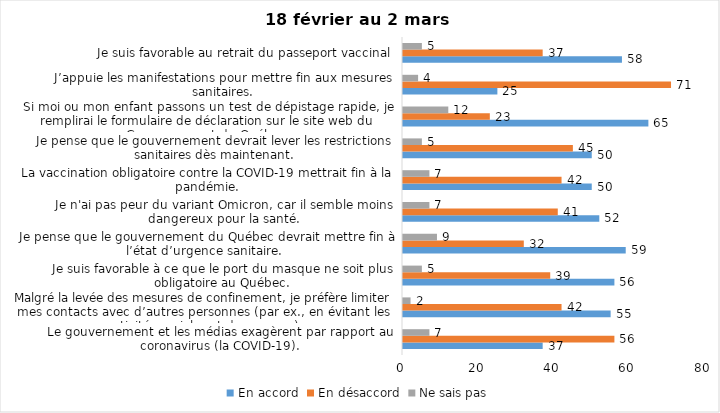
| Category | En accord | En désaccord | Ne sais pas |
|---|---|---|---|
| Le gouvernement et les médias exagèrent par rapport au coronavirus (la COVID-19). | 37 | 56 | 7 |
| Malgré la levée des mesures de confinement, je préfère limiter mes contacts avec d’autres personnes (par ex., en évitant les activités sociales et de groupes) | 55 | 42 | 2 |
| Je suis favorable à ce que le port du masque ne soit plus obligatoire au Québec. | 56 | 39 | 5 |
| Je pense que le gouvernement du Québec devrait mettre fin à l’état d’urgence sanitaire.  | 59 | 32 | 9 |
| Je n'ai pas peur du variant Omicron, car il semble moins dangereux pour la santé. | 52 | 41 | 7 |
| La vaccination obligatoire contre la COVID-19 mettrait fin à la pandémie. | 50 | 42 | 7 |
| Je pense que le gouvernement devrait lever les restrictions sanitaires dès maintenant. | 50 | 45 | 5 |
| Si moi ou mon enfant passons un test de dépistage rapide, je remplirai le formulaire de déclaration sur le site web du Gouvernement du Québec. | 65 | 23 | 12 |
| J’appuie les manifestations pour mettre fin aux mesures sanitaires. | 25 | 71 | 4 |
| Je suis favorable au retrait du passeport vaccinal | 58 | 37 | 5 |